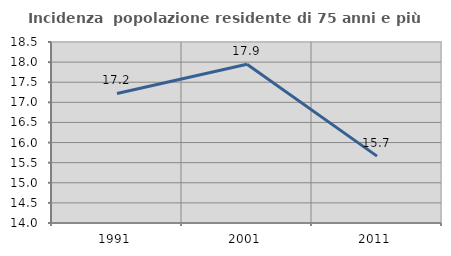
| Category | Incidenza  popolazione residente di 75 anni e più |
|---|---|
| 1991.0 | 17.221 |
| 2001.0 | 17.949 |
| 2011.0 | 15.663 |